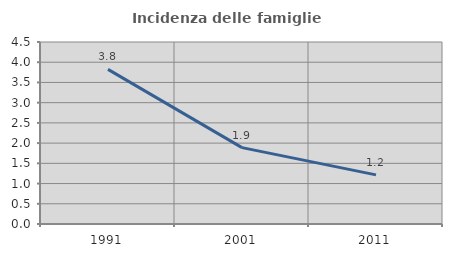
| Category | Incidenza delle famiglie numerose |
|---|---|
| 1991.0 | 3.824 |
| 2001.0 | 1.888 |
| 2011.0 | 1.215 |